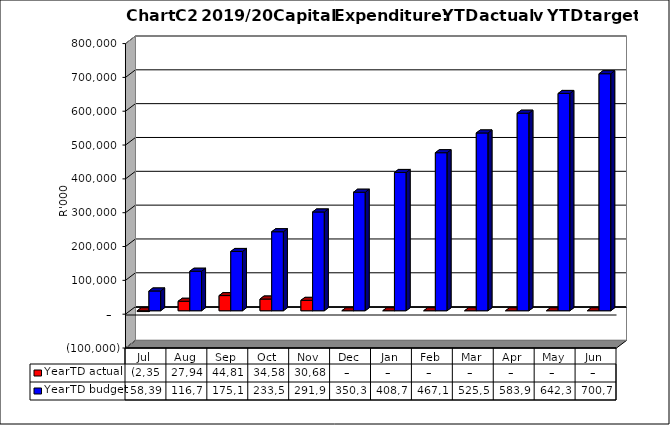
| Category | YearTD actual | YearTD budget |
|---|---|---|
| Jul | -2354849.52 | 58394184.533 |
| Aug | 27946048.88 | 116788369.067 |
| Sep | 44817031.05 | 175182553.6 |
| Oct | 34585671.62 | 233576738.133 |
| Nov | 30684238.44 | 291970922.667 |
| Dec | 0 | 350365107.2 |
| Jan | 0 | 408759291.733 |
| Feb | 0 | 467153476.267 |
| Mar | 0 | 525547660.8 |
| Apr | 0 | 583941845.333 |
| May | 0 | 642336029.867 |
| Jun | 0 | 700730214.4 |